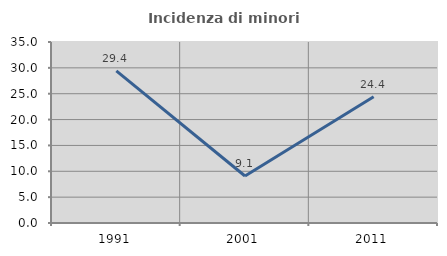
| Category | Incidenza di minori stranieri |
|---|---|
| 1991.0 | 29.412 |
| 2001.0 | 9.091 |
| 2011.0 | 24.402 |